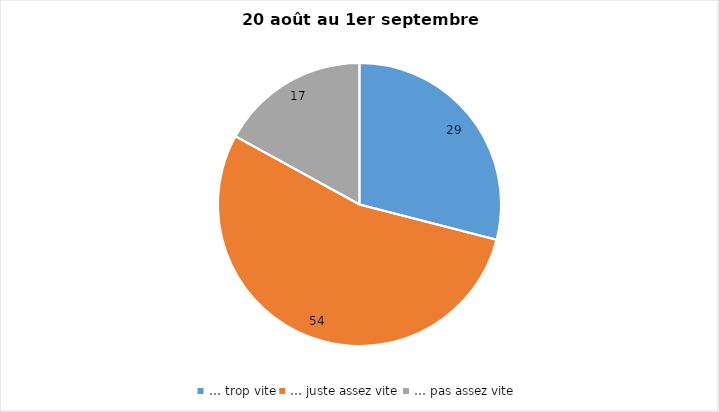
| Category | Series 0 |
|---|---|
| … trop vite | 29 |
| … juste assez vite | 54 |
| … pas assez vite | 17 |